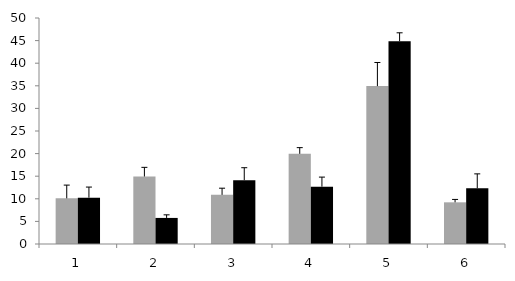
| Category | Average wt Ctip2 C2/Rluc | Average 315T Ctip2 C2/Rluc |
|---|---|---|
| 0 | 10.101 | 10.248 |
| 1 | 14.927 | 5.768 |
| 2 | 10.874 | 14.121 |
| 3 | 19.947 | 12.682 |
| 4 | 34.93 | 44.855 |
| 5 | 9.221 | 12.326 |